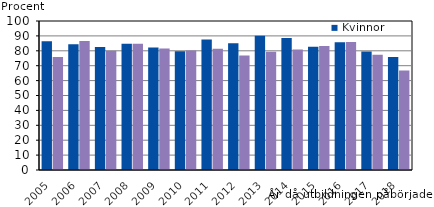
| Category | Kvinnor | Män |
|---|---|---|
| 2005.0 | 86.364 | 75.909 |
| 2006.0 | 84.375 | 86.559 |
| 2007.0 | 82.53 | 80 |
| 2008.0 | 84.795 | 84.762 |
| 2009.0 | 82.292 | 81.579 |
| 2010.0 | 79.651 | 80.193 |
| 2011.0 | 87.629 | 81.364 |
| 2012.0 | 85.065 | 76.768 |
| 2013.0 | 90.141 | 79.381 |
| 2014.0 | 88.623 | 80.808 |
| 2015.0 | 82.667 | 83.254 |
| 2016.0 | 85.821 | 85.955 |
| 2017.0 | 79.605 | 77.401 |
| 2018.0 | 75.796 | 66.86 |